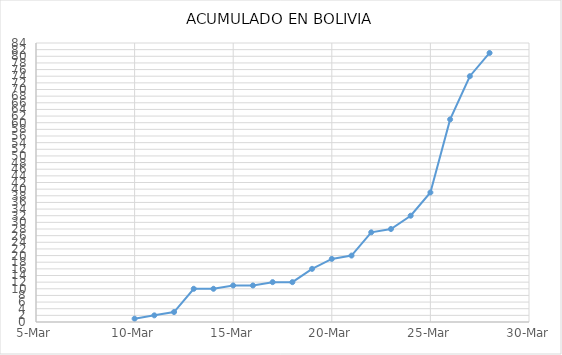
| Category | Series 0 |
|---|---|
| 43900.0 | 1 |
| 43901.0 | 2 |
| 43902.0 | 3 |
| 43903.0 | 10 |
| 43904.0 | 10 |
| 43905.0 | 11 |
| 43906.0 | 11 |
| 43907.0 | 12 |
| 43908.0 | 12 |
| 43909.0 | 16 |
| 43910.0 | 19 |
| 43911.0 | 20 |
| 43912.0 | 27 |
| 43913.0 | 28 |
| 43914.0 | 32 |
| 43915.0 | 39 |
| 43916.0 | 61 |
| 43917.0 | 74 |
| 43918.0 | 81 |